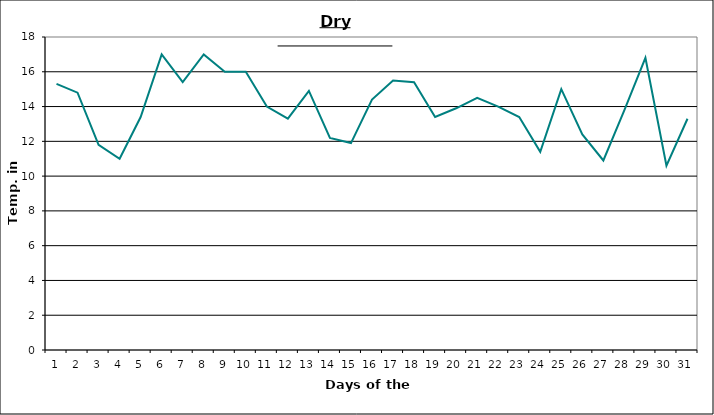
| Category | Series 0 |
|---|---|
| 0 | 15.3 |
| 1 | 14.8 |
| 2 | 11.8 |
| 3 | 11 |
| 4 | 13.4 |
| 5 | 17 |
| 6 | 15.4 |
| 7 | 17 |
| 8 | 16 |
| 9 | 16 |
| 10 | 14 |
| 11 | 13.3 |
| 12 | 14.9 |
| 13 | 12.2 |
| 14 | 11.9 |
| 15 | 14.4 |
| 16 | 15.5 |
| 17 | 15.4 |
| 18 | 13.4 |
| 19 | 13.9 |
| 20 | 14.5 |
| 21 | 14 |
| 22 | 13.4 |
| 23 | 11.4 |
| 24 | 15 |
| 25 | 12.4 |
| 26 | 10.9 |
| 27 | 13.8 |
| 28 | 16.8 |
| 29 | 10.6 |
| 30 | 13.3 |